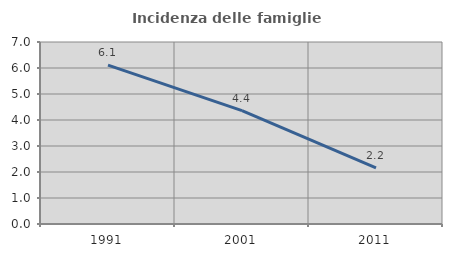
| Category | Incidenza delle famiglie numerose |
|---|---|
| 1991.0 | 6.111 |
| 2001.0 | 4.36 |
| 2011.0 | 2.156 |